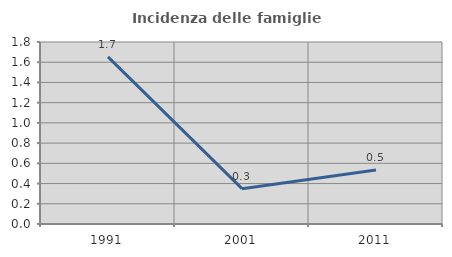
| Category | Incidenza delle famiglie numerose |
|---|---|
| 1991.0 | 1.653 |
| 2001.0 | 0.349 |
| 2011.0 | 0.534 |